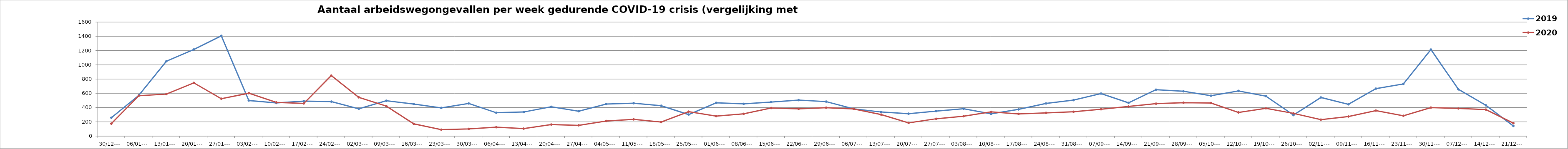
| Category | 2019 | 2020 |
|---|---|---|
| 30/12--- | 258 | 175 |
| 06/01--- | 572 | 567 |
| 13/01--- | 1050 | 589 |
| 20/01--- | 1215 | 747 |
| 27/01--- | 1407 | 524 |
| 03/02--- | 499 | 602 |
| 10/02--- | 465 | 473 |
| 17/02--- | 490 | 458 |
| 24/02--- | 484 | 849 |
| 02/03--- | 383 | 544 |
| 09/03--- | 496 | 421 |
| 16/03--- | 449 | 172 |
| 23/03--- | 396 | 90 |
| 30/03--- | 458 | 101 |
| 06/04--- | 328 | 125 |
| 13/04--- | 338 | 105 |
| 20/04--- | 411 | 162 |
| 27/04--- | 349 | 151 |
| 04/05--- | 449 | 212 |
| 11/05--- | 461 | 235 |
| 18/05--- | 426 | 197 |
| 25/05--- | 302 | 343 |
| 01/06--- | 467 | 280 |
| 08/06--- | 452 | 312 |
| 15/06--- | 478 | 394 |
| 22/06--- | 505 | 382 |
| 29/06--- | 484 | 399 |
| 06/07--- | 383 | 381 |
| 13/07--- | 338 | 302 |
| 20/07--- | 314 | 186 |
| 27/07--- | 350 | 243 |
| 03/08--- | 384 | 279 |
| 10/08--- | 312 | 340 |
| 17/08--- | 375 | 311 |
| 24/08--- | 458 | 326 |
| 31/08--- | 505 | 341 |
| 07/09--- | 597 | 377 |
| 14/09--- | 467 | 416 |
| 21/09--- | 651 | 455 |
| 28/09--- | 629 | 469 |
| 05/10--- | 567 | 464 |
| 12/10--- | 634 | 332 |
| 19/10--- | 560 | 390 |
| 26/10--- | 295 | 319 |
| 02/11--- | 542 | 231 |
| 09/11--- | 446 | 275 |
| 16/11--- | 666 | 358 |
| 23/11--- | 732 | 285 |
| 30/11--- | 1214 | 400 |
| 07/12--- | 656 | 388 |
| 14/12--- | 432 | 372 |
| 21/12--- | 142 | 182 |